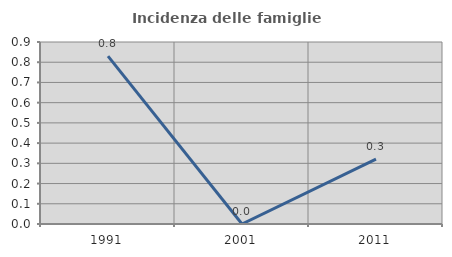
| Category | Incidenza delle famiglie numerose |
|---|---|
| 1991.0 | 0.83 |
| 2001.0 | 0 |
| 2011.0 | 0.321 |